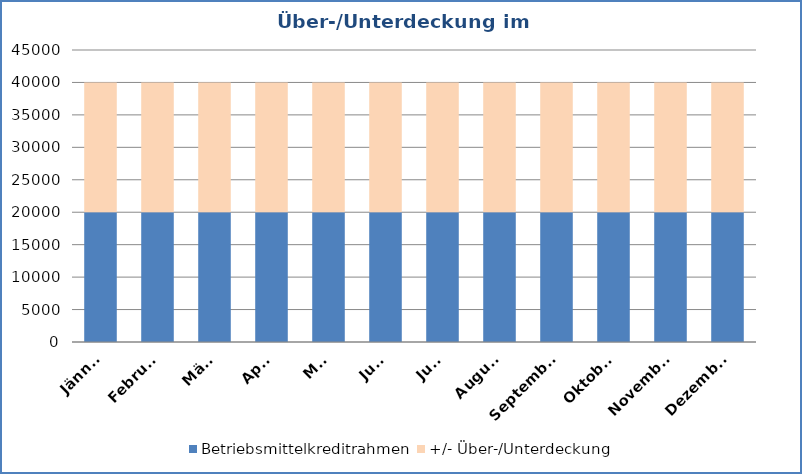
| Category | Betriebsmittelkreditrahmen | +/- Über-/Unterdeckung |
|---|---|---|
| Jänner | 20000 | 20000 |
| Februar | 20000 | 20000 |
| März | 20000 | 20000 |
| April | 20000 | 20000 |
| Mai | 20000 | 20000 |
| Juni | 20000 | 20000 |
| Juli | 20000 | 20000 |
| August | 20000 | 20000 |
| September | 20000 | 20000 |
| Oktober | 20000 | 20000 |
| November | 20000 | 20000 |
| Dezember | 20000 | 20000 |